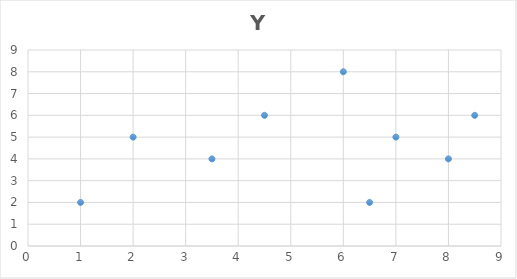
| Category | Y |
|---|---|
| 1.0 | 2 |
| 2.0 | 5 |
| 3.5 | 4 |
| 4.5 | 6 |
| 6.0 | 8 |
| 6.5 | 2 |
| 7.0 | 5 |
| 8.0 | 4 |
| 8.5 | 6 |